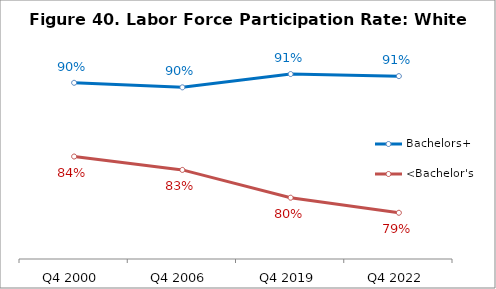
| Category | Bachelors+ | <Bachelor's |
|---|---|---|
| Q4 2000 | 0.901 | 0.838 |
| Q4 2006 | 0.897 | 0.826 |
| Q4 2019 | 0.909 | 0.803 |
| Q4 2022 | 0.907 | 0.79 |